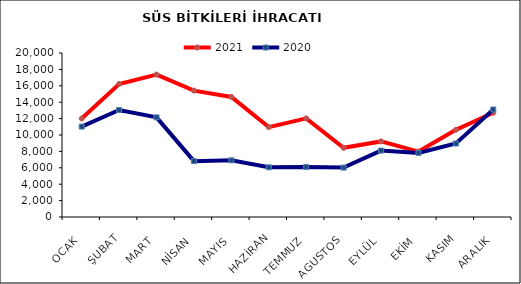
| Category | 2021 | 2020 |
|---|---|---|
| OCAK | 12015.773 | 11024.011 |
| ŞUBAT | 16226.111 | 13044.34 |
| MART | 17369.886 | 12149.519 |
| NİSAN | 15412.279 | 6813.295 |
| MAYIS | 14638.275 | 6914.249 |
| HAZİRAN | 10961.588 | 6061.073 |
| TEMMUZ | 12028.239 | 6099.33 |
| AGUSTOS | 8439.406 | 6022.598 |
| EYLÜL | 9218.288 | 8099.631 |
| EKİM | 7979.695 | 7811.141 |
| KASIM | 10633.564 | 8959.74 |
| ARALIK | 12710.679 | 13108.625 |